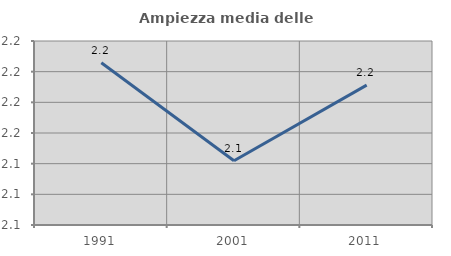
| Category | Ampiezza media delle famiglie |
|---|---|
| 1991.0 | 2.173 |
| 2001.0 | 2.141 |
| 2011.0 | 2.166 |